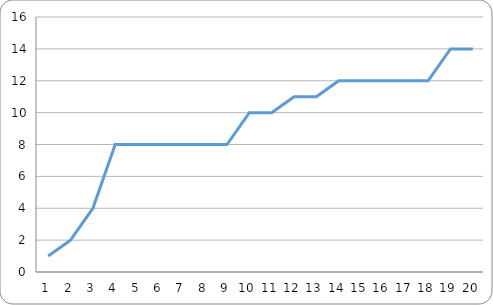
| Category | new |
|---|---|
| 0 | 1 |
| 1 | 2 |
| 2 | 4 |
| 3 | 8 |
| 4 | 8 |
| 5 | 8 |
| 6 | 8 |
| 7 | 8 |
| 8 | 8 |
| 9 | 10 |
| 10 | 10 |
| 11 | 11 |
| 12 | 11 |
| 13 | 12 |
| 14 | 12 |
| 15 | 12 |
| 16 | 12 |
| 17 | 12 |
| 18 | 14 |
| 19 | 14 |